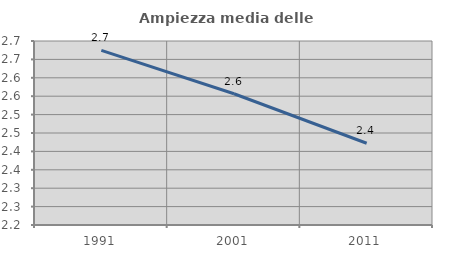
| Category | Ampiezza media delle famiglie |
|---|---|
| 1991.0 | 2.675 |
| 2001.0 | 2.557 |
| 2011.0 | 2.422 |